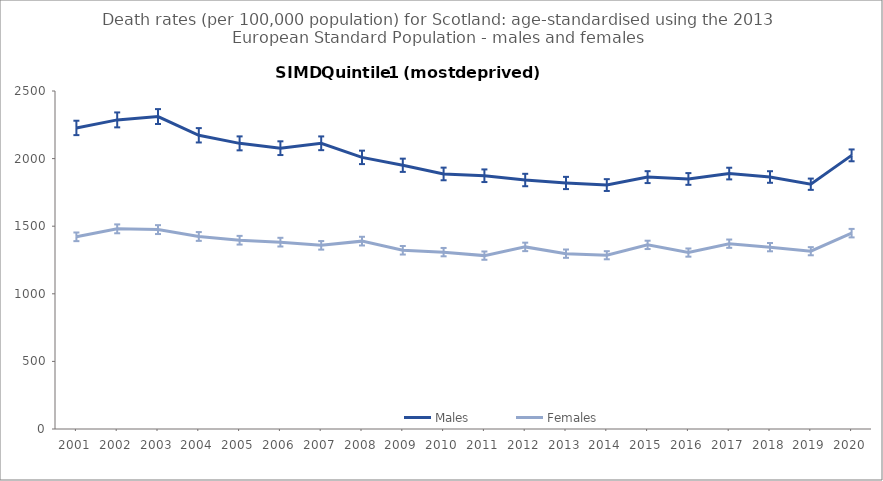
| Category | Males | Females |
|---|---|---|
| 2001.0 | 2226.9 | 1421.5 |
| 2002.0 | 2286.3 | 1480.5 |
| 2003.0 | 2311 | 1474.9 |
| 2004.0 | 2172.4 | 1424.1 |
| 2005.0 | 2112.7 | 1396.2 |
| 2006.0 | 2077.1 | 1382 |
| 2007.0 | 2113.3 | 1358.4 |
| 2008.0 | 2009.1 | 1389.5 |
| 2009.0 | 1950.6 | 1321.9 |
| 2010.0 | 1886.5 | 1308.2 |
| 2011.0 | 1873.3 | 1282.4 |
| 2012.0 | 1841.6 | 1346.9 |
| 2013.0 | 1819.7 | 1296.9 |
| 2014.0 | 1804.3 | 1285.2 |
| 2015.0 | 1863 | 1361.9 |
| 2016.0 | 1849.4 | 1304.9 |
| 2017.0 | 1889.3 | 1370.7 |
| 2018.0 | 1863.9 | 1345 |
| 2019.0 | 1810.5 | 1315 |
| 2020.0 | 2024 | 1448.6 |